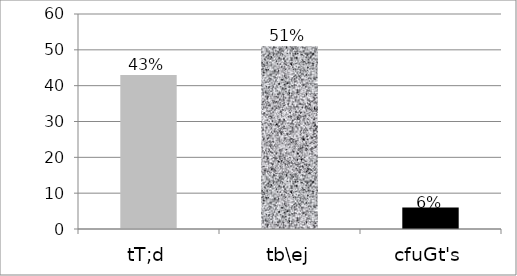
| Category | Series 0 |
|---|---|
| tT;d | 43 |
| tb\ej | 51 |
| cfuGt's | 6 |